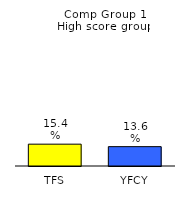
| Category | Series 0 |
|---|---|
| TFS | 0.154 |
| YFCY | 0.136 |